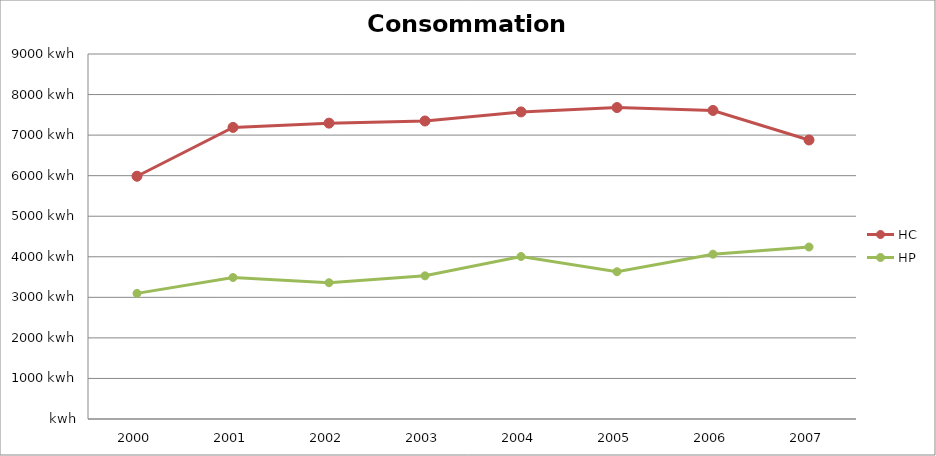
| Category | HC | HP |
|---|---|---|
| 2000.0 | 5986 | 3098 |
| 2001.0 | 7190 | 3489 |
| 2002.0 | 7295 | 3360 |
| 2003.0 | 7348 | 3530 |
| 2004.0 | 7572 | 4007 |
| 2005.0 | 7680 | 3631 |
| 2006.0 | 7608 | 4064 |
| 2007.0 | 6880 | 4241 |